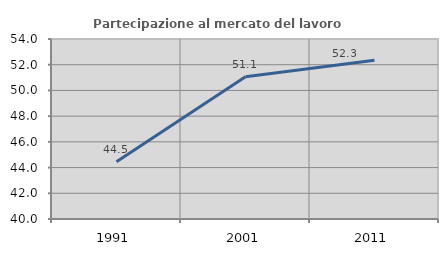
| Category | Partecipazione al mercato del lavoro  femminile |
|---|---|
| 1991.0 | 44.454 |
| 2001.0 | 51.071 |
| 2011.0 | 52.343 |